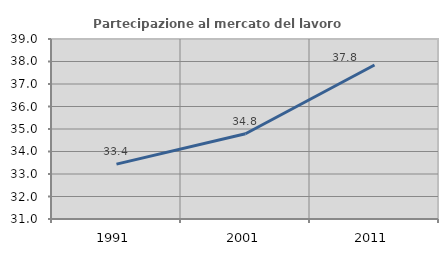
| Category | Partecipazione al mercato del lavoro  femminile |
|---|---|
| 1991.0 | 33.439 |
| 2001.0 | 34.787 |
| 2011.0 | 37.846 |